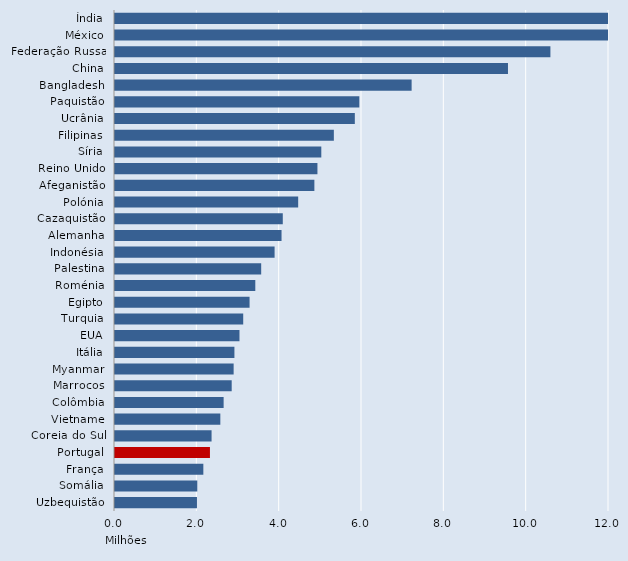
| Category | Series 0 |
|---|---|
| Índia | 15.576 |
| México | 12.339 |
| Federação Russa | 10.577 |
| China | 9.546 |
| Bangladesh | 7.205 |
| Paquistão | 5.935 |
| Ucrânia | 5.826 |
| Filipinas | 5.316 |
| Síria | 5.012 |
| Reino Unido | 4.917 |
| Afeganistão | 4.843 |
| Polónia | 4.45 |
| Cazaquistão | 4.076 |
| Alemanha | 4.045 |
| Indonésia | 3.877 |
| Palestina | 3.551 |
| Roménia | 3.408 |
| Egipto | 3.269 |
| Turquia | 3.114 |
| EUA | 3.024 |
| Itália | 2.901 |
| Myanmar | 2.882 |
| Marrocos | 2.835 |
| Colômbia | 2.639 |
| Vietname | 2.559 |
| Coreia do Sul | 2.346 |
| Portugal | 2.306 |
| França | 2.146 |
| Somália | 1.999 |
| Uzbequistão | 1.991 |